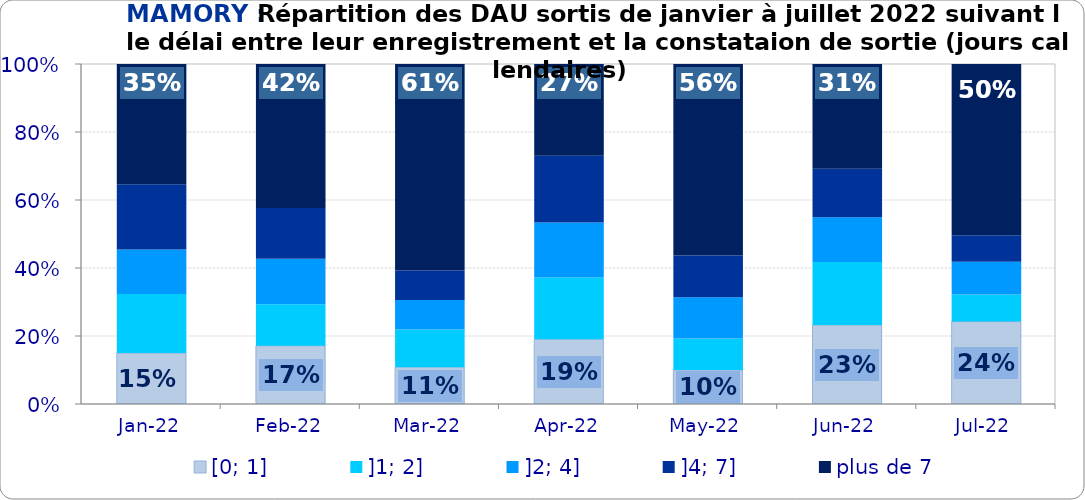
| Category | [0; 1] | ]1; 2] | ]2; 4] | ]4; 7] | plus de 7 |
|---|---|---|---|---|---|
| 2022-01-01 | 0.15 | 0.173 | 0.131 | 0.192 | 0.354 |
| 2022-02-01 | 0.171 | 0.122 | 0.134 | 0.149 | 0.423 |
| 2022-03-01 | 0.108 | 0.111 | 0.087 | 0.086 | 0.608 |
| 2022-04-01 | 0.19 | 0.182 | 0.162 | 0.197 | 0.27 |
| 2022-05-01 | 0.1 | 0.093 | 0.121 | 0.123 | 0.563 |
| 2022-06-01 | 0.232 | 0.186 | 0.131 | 0.143 | 0.308 |
| 2022-07-01 | 0.242 | 0.08 | 0.096 | 0.078 | 0.504 |